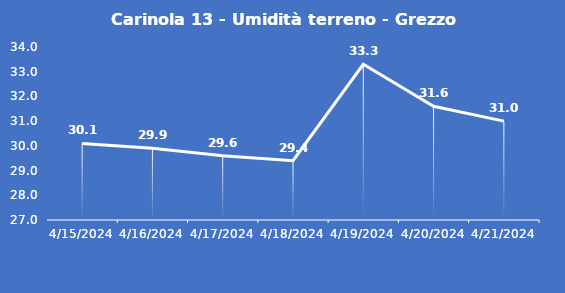
| Category | Carinola 13 - Umidità terreno - Grezzo (%VWC) |
|---|---|
| 4/15/24 | 30.1 |
| 4/16/24 | 29.9 |
| 4/17/24 | 29.6 |
| 4/18/24 | 29.4 |
| 4/19/24 | 33.3 |
| 4/20/24 | 31.6 |
| 4/21/24 | 31 |